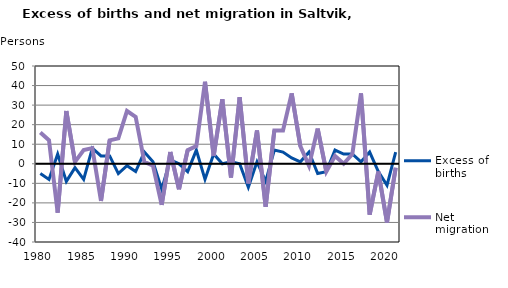
| Category | Excess of births | Net migration |
|---|---|---|
| 1980.0 | -5 | 16 |
| 1981.0 | -8 | 12 |
| 1982.0 | 5 | -25 |
| 1983.0 | -9 | 27 |
| 1984.0 | -2 | 1 |
| 1985.0 | -8 | 7 |
| 1986.0 | 8 | 8 |
| 1987.0 | 4 | -19 |
| 1988.0 | 4 | 12 |
| 1989.0 | -5 | 13 |
| 1990.0 | -1 | 27 |
| 1991.0 | -4 | 24 |
| 1992.0 | 6 | 1 |
| 1993.0 | 1 | -1 |
| 1994.0 | -13 | -21 |
| 1995.0 | 2 | 6 |
| 1996.0 | 0 | -13 |
| 1997.0 | -4 | 7 |
| 1998.0 | 7 | 9 |
| 1999.0 | -8 | 42 |
| 2000.0 | 5 | 4 |
| 2001.0 | 0 | 33 |
| 2002.0 | 1 | -7 |
| 2003.0 | 0 | 34 |
| 2004.0 | -12 | -10 |
| 2005.0 | 1 | 17 |
| 2006.0 | -9 | -22 |
| 2007.0 | 7 | 17 |
| 2008.0 | 6 | 17 |
| 2009.0 | 3 | 36 |
| 2010.0 | 1 | 9 |
| 2011.0 | 6 | -1 |
| 2012.0 | -5 | 18 |
| 2013.0 | -4 | -4 |
| 2014.0 | 7 | 4 |
| 2015.0 | 5 | 0 |
| 2016.0 | 5 | 5 |
| 2017.0 | 1 | 36 |
| 2018.0 | 6 | -26 |
| 2019.0 | -4 | -4 |
| 2020.0 | -11 | -30 |
| 2021.0 | 6 | -2 |